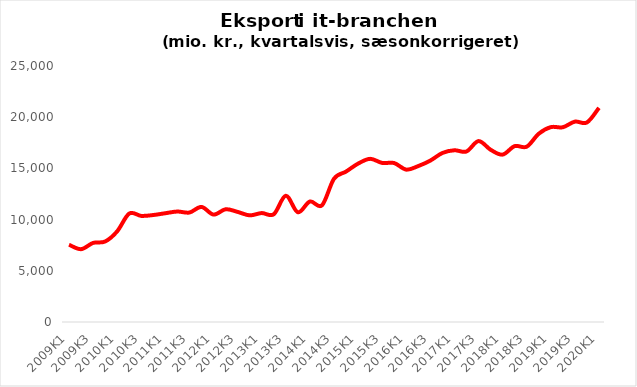
| Category | Samlet eksport i It-branchen |
|---|---|
| 2009K1 | 7545.699 |
| 2009K2 | 7112.633 |
| 2009K3 | 7723.289 |
| 2009K4 | 7862.233 |
| 2010K1 | 8857.773 |
| 2010K2 | 10590.902 |
| 2010K3 | 10361.903 |
| 2010K4 | 10446.651 |
| 2011K1 | 10622.871 |
| 2011K2 | 10788.429 |
| 2011K3 | 10690.444 |
| 2011K4 | 11237.396 |
| 2012K1 | 10486.534 |
| 2012K2 | 11010.611 |
| 2012K3 | 10750.281 |
| 2012K4 | 10414.178 |
| 2013K1 | 10638.329 |
| 2013K2 | 10523.02 |
| 2013K3 | 12330.781 |
| 2013K4 | 10716.198 |
| 2014K1 | 11769.874 |
| 2014K2 | 11391.373 |
| 2014K3 | 13988.322 |
| 2014K4 | 14689.517 |
| 2015K1 | 15467.496 |
| 2015K2 | 15934.486 |
| 2015K3 | 15535.252 |
| 2015K4 | 15520.721 |
| 2016K1 | 14881.466 |
| 2016K2 | 15231.517 |
| 2016K3 | 15764.538 |
| 2016K4 | 16506.239 |
| 2017K1 | 16771.966 |
| 2017K2 | 16652.316 |
| 2017K3 | 17667.906 |
| 2017K4 | 16824.053 |
| 2018K1 | 16346.557 |
| 2018K2 | 17176.729 |
| 2018K3 | 17121.213 |
| 2018K4 | 18385.754 |
| 2019K1 | 19030.539 |
| 2019K2 | 19019.3 |
| 2019K3 | 19568.5 |
| 2019K4 | 19486.896 |
| 2020K1 | 20914.8 |